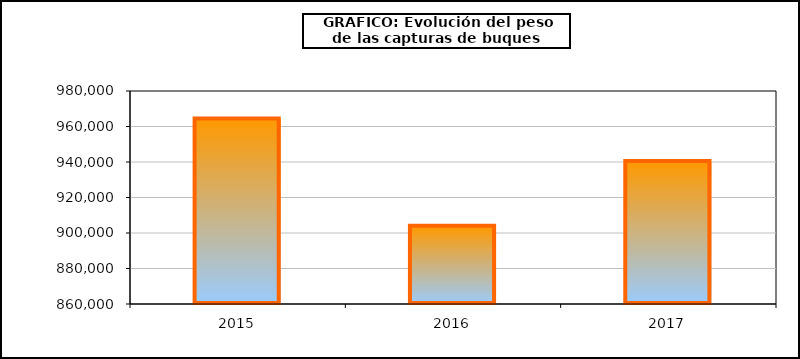
| Category | Series1 |
|---|---|
| 0 | 964554.316 |
| 1 | 904031.611 |
| 2 | 940633.127 |